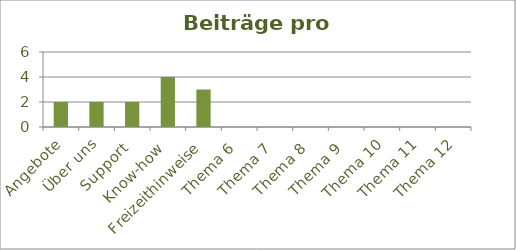
| Category | Beiträge |
|---|---|
| Angebote | 2 |
| Über uns | 2 |
| Support | 2 |
| Know-how | 4 |
| Freizeithinweise | 3 |
| Thema 6 | 0 |
| Thema 7 | 0 |
| Thema 8 | 0 |
| Thema 9 | 0 |
| Thema 10 | 0 |
| Thema 11 | 0 |
| Thema 12 | 0 |